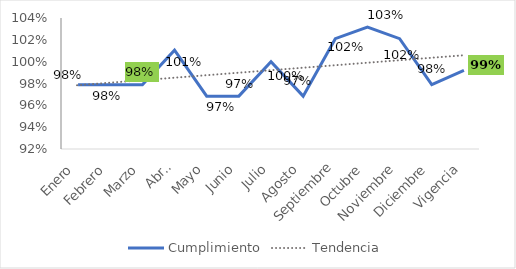
| Category | Cumplimiento |
|---|---|
| Enero | 0.979 |
| Febrero | 0.979 |
| Marzo | 0.979 |
| Abril | 1.011 |
| Mayo | 0.968 |
| Junio | 0.968 |
| Julio | 1 |
| Agosto | 0.968 |
| Septiembre | 1.021 |
| Octubre | 1.032 |
| Noviembre | 1.021 |
| Diciembre | 0.979 |
| Vigencia | 0.992 |